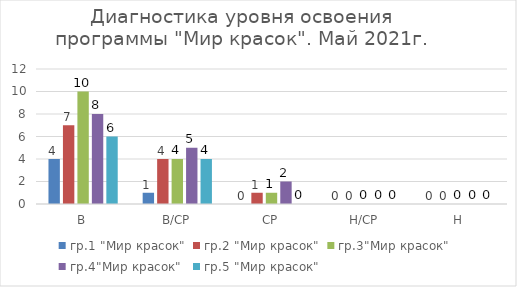
| Category | гр.1 "Мир красок" | гр.2 "Мир красок" | гр.3"Мир красок" | гр.4"Мир красок" | гр.5 "Мир красок" |
|---|---|---|---|---|---|
| В | 4 | 7 | 10 | 8 | 6 |
| В/СР | 1 | 4 | 4 | 5 | 4 |
| СР | 0 | 1 | 1 | 2 | 0 |
| Н/СР | 0 | 0 | 0 | 0 | 0 |
| Н | 0 | 0 | 0 | 0 | 0 |